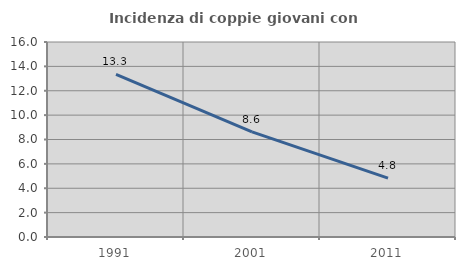
| Category | Incidenza di coppie giovani con figli |
|---|---|
| 1991.0 | 13.348 |
| 2001.0 | 8.622 |
| 2011.0 | 4.837 |